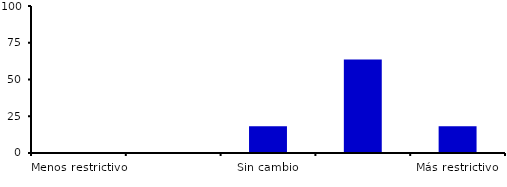
| Category | Series 0 |
|---|---|
| Menos restrictivo | 0 |
| Moderadamente menos restrictivo | 0 |
| Sin cambio | 18.182 |
| Moderadamente más restrictivo | 63.636 |
| Más restrictivo | 18.182 |